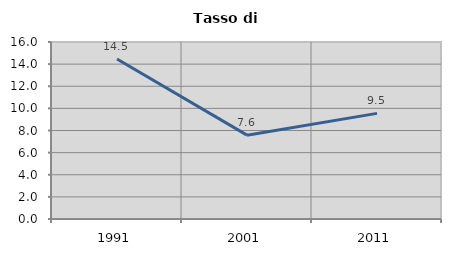
| Category | Tasso di disoccupazione   |
|---|---|
| 1991.0 | 14.457 |
| 2001.0 | 7.578 |
| 2011.0 | 9.547 |